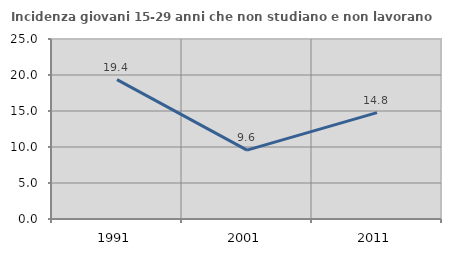
| Category | Incidenza giovani 15-29 anni che non studiano e non lavorano  |
|---|---|
| 1991.0 | 19.362 |
| 2001.0 | 9.563 |
| 2011.0 | 14.777 |